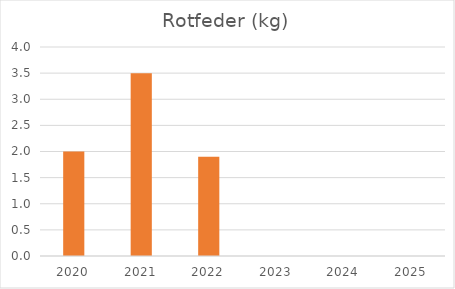
| Category | Rotfeder (kg) |
|---|---|
| 2020.0 | 2 |
| 2021.0 | 3.5 |
| 2022.0 | 1.9 |
| 2023.0 | 0 |
| 2024.0 | 0 |
| 2025.0 | 0 |